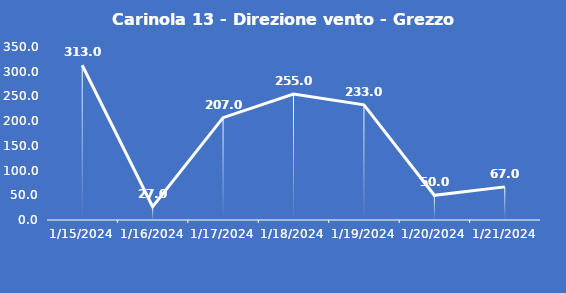
| Category | Carinola 13 - Direzione vento - Grezzo (°N) |
|---|---|
| 1/15/24 | 313 |
| 1/16/24 | 27 |
| 1/17/24 | 207 |
| 1/18/24 | 255 |
| 1/19/24 | 233 |
| 1/20/24 | 50 |
| 1/21/24 | 67 |